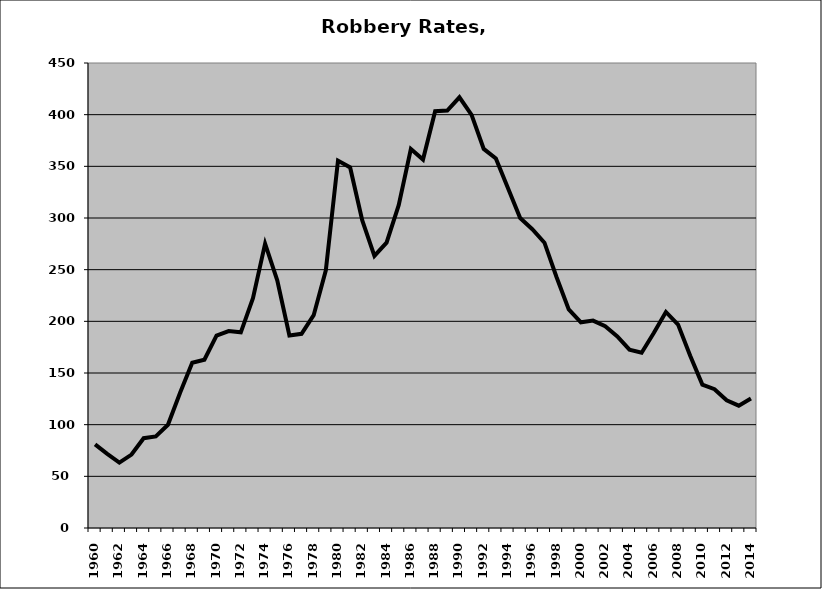
| Category | Robbery |
|---|---|
| 1960.0 | 80.884 |
| 1961.0 | 71.735 |
| 1962.0 | 63.327 |
| 1963.0 | 71.072 |
| 1964.0 | 86.906 |
| 1965.0 | 88.648 |
| 1966.0 | 99.865 |
| 1967.0 | 130.942 |
| 1968.0 | 159.886 |
| 1969.0 | 162.811 |
| 1970.0 | 186.112 |
| 1971.0 | 190.626 |
| 1972.0 | 189.351 |
| 1973.0 | 222.31 |
| 1974.0 | 275.192 |
| 1975.0 | 239.691 |
| 1976.0 | 186.379 |
| 1977.0 | 187.944 |
| 1978.0 | 205.969 |
| 1979.0 | 249.402 |
| 1980.0 | 355.541 |
| 1981.0 | 348.938 |
| 1982.0 | 297.638 |
| 1983.0 | 263.352 |
| 1984.0 | 276.157 |
| 1985.0 | 312.388 |
| 1986.0 | 366.784 |
| 1987.0 | 356.558 |
| 1988.0 | 403.296 |
| 1989.0 | 403.978 |
| 1990.0 | 416.821 |
| 1991.0 | 399.812 |
| 1992.0 | 366.859 |
| 1993.0 | 357.577 |
| 1994.0 | 328.754 |
| 1995.0 | 299.908 |
| 1996.0 | 289.188 |
| 1997.0 | 276.095 |
| 1998.0 | 242.679 |
| 1999.0 | 211.558 |
| 2000.0 | 199.025 |
| 2001.0 | 200.735 |
| 2002.0 | 195.193 |
| 2003.0 | 185.438 |
| 2004.0 | 172.541 |
| 2005.0 | 169.635 |
| 2006.0 | 188.763 |
| 2007.0 | 209.06 |
| 2008.0 | 196.859 |
| 2009.0 | 166.744 |
| 2010.0 | 138.746 |
| 2011.0 | 134.271 |
| 2012.0 | 123.644 |
| 2013.0 | 118.365 |
| 2014.0 | 125.238 |